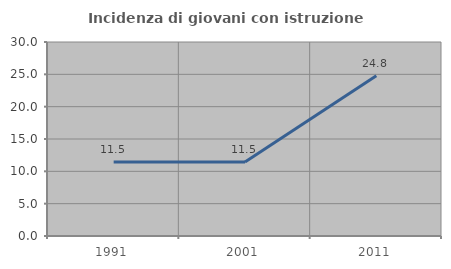
| Category | Incidenza di giovani con istruzione universitaria |
|---|---|
| 1991.0 | 11.45 |
| 2001.0 | 11.45 |
| 2011.0 | 24.786 |